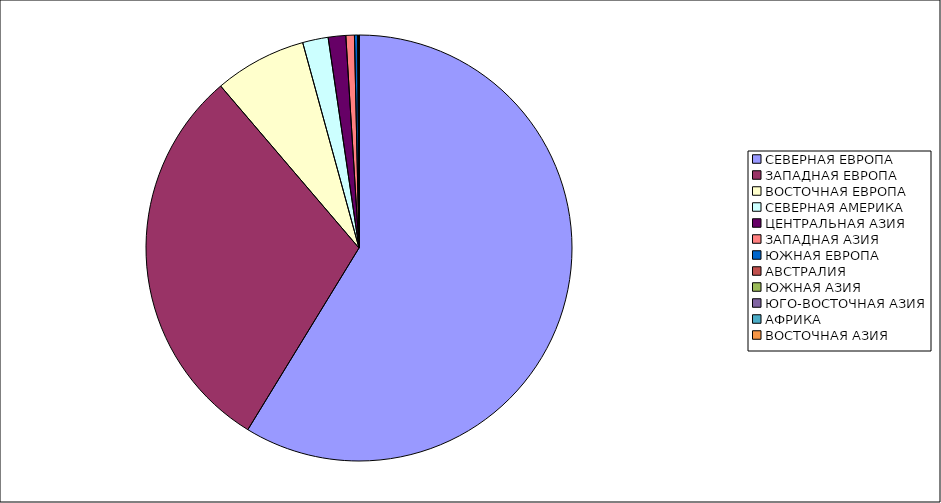
| Category | Оборот |
|---|---|
| СЕВЕРНАЯ ЕВРОПА | 58.739 |
| ЗАПАДНАЯ ЕВРОПА | 30.009 |
| ВОСТОЧНАЯ ЕВРОПА | 6.992 |
| СЕВЕРНАЯ АМЕРИКА | 1.94 |
| ЦЕНТРАЛЬНАЯ АЗИЯ | 1.332 |
| ЗАПАДНАЯ АЗИЯ | 0.645 |
| ЮЖНАЯ ЕВРОПА | 0.242 |
| АВСТРАЛИЯ | 0.051 |
| ЮЖНАЯ АЗИЯ | 0.031 |
| ЮГО-ВОСТОЧНАЯ АЗИЯ | 0.01 |
| АФРИКА | 0.006 |
| ВОСТОЧНАЯ АЗИЯ | 0.001 |